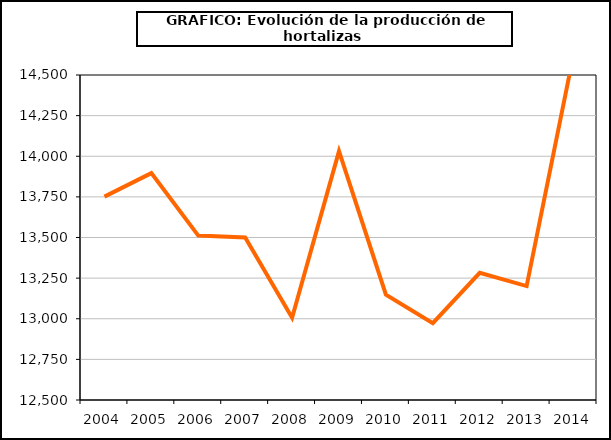
| Category | producción |
|---|---|
| 2004.0 | 13751.458 |
| 2005.0 | 13896.107 |
| 2006.0 | 13511.668 |
| 2007.0 | 13500.62 |
| 2008.0 | 13006.461 |
| 2009.0 | 14030.874 |
| 2010.0 | 13148.152 |
| 2011.0 | 12972.604 |
| 2012.0 | 13282.939 |
| 2013.0 | 13201.085 |
| 2014.0 | 14626.126 |